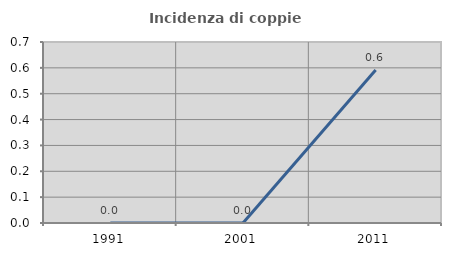
| Category | Incidenza di coppie miste |
|---|---|
| 1991.0 | 0 |
| 2001.0 | 0 |
| 2011.0 | 0.592 |